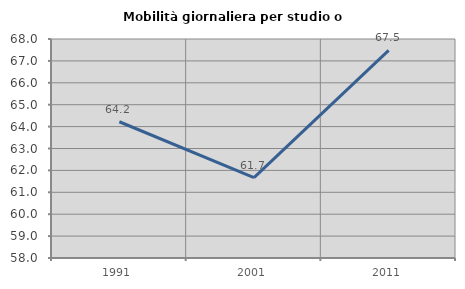
| Category | Mobilità giornaliera per studio o lavoro |
|---|---|
| 1991.0 | 64.221 |
| 2001.0 | 61.667 |
| 2011.0 | 67.478 |